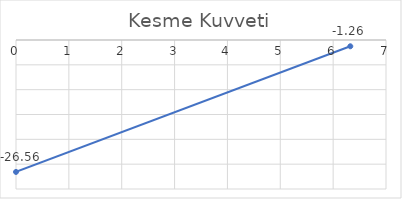
| Category | Series 0 |
|---|---|
| 0.0 | -26.563 |
| 6.324555320336759 | -1.264 |